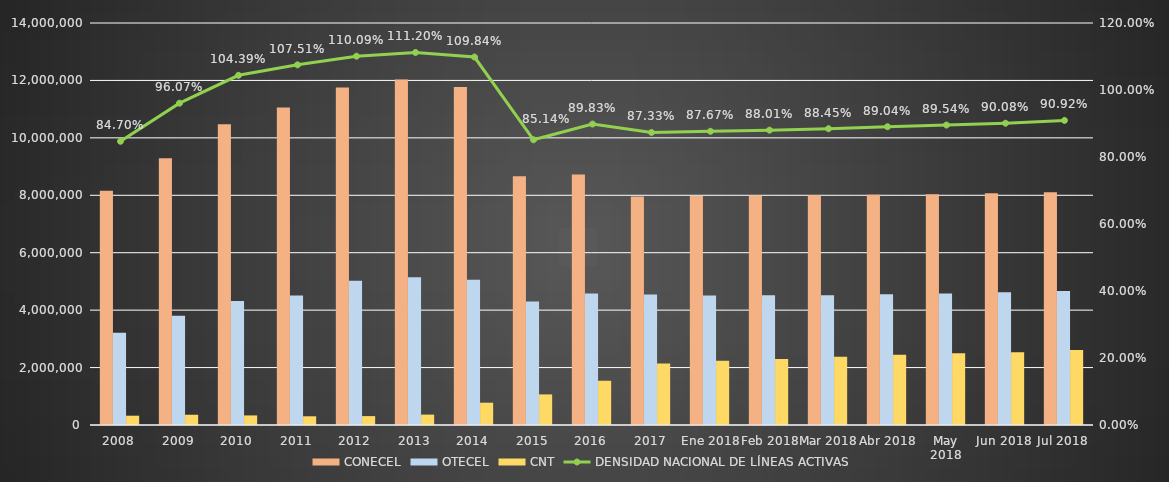
| Category | CONECEL | OTECEL | CNT |
|---|---|---|---|
| 2008 | 8156359 | 3211922 | 323967 |
| 2009 | 9291268 | 3806432 | 356900 |
| 2010 | 10470502 | 4314599 | 333730 |
| 2011 | 11057316 | 4513874 | 303368 |
| 2012 | 11757906 | 5019686 | 309271 |
| 2013 | 12030886 | 5148308 | 362560 |
| 2014 | 11772020 | 5055645 | 776892 |
| 2015 | 8658619 | 4303330 | 1065703 |
| 2016 | 8726823 | 4580092 | 1541219 |
| 2017 | 7960263 | 4549024 | 2142117 |
| Ene 2018 | 7976030 | 4513686 | 2236840 |
| Feb 2018 | 7989122 | 4515681 | 2297296 |
| Mar 2018 | 8000375 | 4515054 | 2378275 |
| Abr 2018 | 8016705 | 4551309 | 2443847 |
| May 2018 | 8036850 | 4582050 | 2495597 |
| Jun 2018 | 8067726 | 4622014 | 2533812 |
| Jul 2018 | 8108264 | 4666163 | 2609567 |